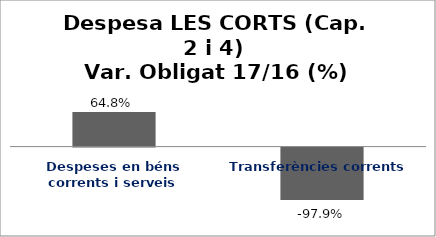
| Category | Series 0 |
|---|---|
| Despeses en béns corrents i serveis | 0.648 |
| Transferències corrents | -0.979 |